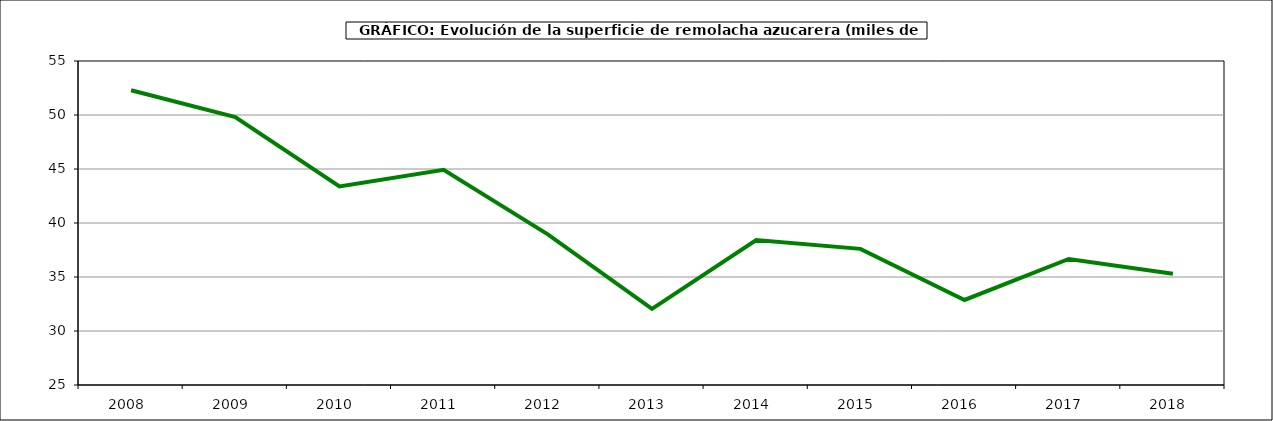
| Category | Superficie |
|---|---|
| 2008.0 | 52.289 |
| 2009.0 | 49.813 |
| 2010.0 | 43.382 |
| 2011.0 | 44.931 |
| 2012.0 | 38.952 |
| 2013.0 | 32.052 |
| 2014.0 | 38.414 |
| 2015.0 | 37.605 |
| 2016.0 | 32.874 |
| 2017.0 | 36.671 |
| 2018.0 | 35.297 |